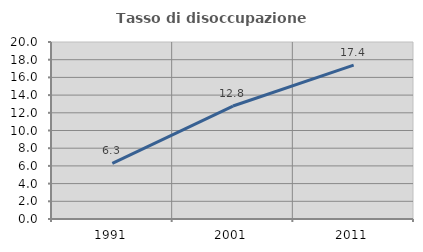
| Category | Tasso di disoccupazione giovanile  |
|---|---|
| 1991.0 | 6.276 |
| 2001.0 | 12.766 |
| 2011.0 | 17.391 |